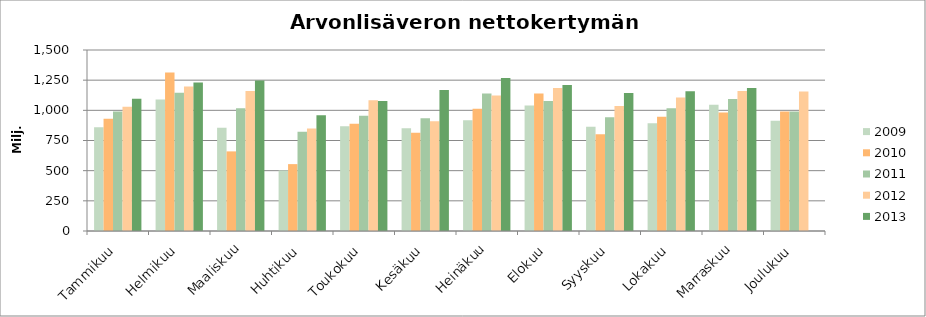
| Category | 2009 | 2010 | 2011 | 2012 | 2013 |
|---|---|---|---|---|---|
| Tammikuu | 858.934 | 929.369 | 989.979 | 1030.641 | 1096.075 |
| Helmikuu | 1089.664 | 1313.151 | 1145.438 | 1198.153 | 1230.33 |
| Maaliskuu | 856.122 | 659.776 | 1016.463 | 1160.067 | 1247.422 |
| Huhtikuu | 501.743 | 554.255 | 821.506 | 848.926 | 959.001 |
| Toukokuu | 867.163 | 889.769 | 955.963 | 1083.741 | 1078.37 |
| Kesäkuu | 851.056 | 814.024 | 933.418 | 909.246 | 1168.206 |
| Heinäkuu | 918.059 | 1013.537 | 1139.789 | 1122.196 | 1267.424 |
| Elokuu | 1040.537 | 1139.703 | 1077.137 | 1184.622 | 1210.636 |
| Syyskuu | 863.546 | 801.068 | 941.737 | 1035.954 | 1142.819 |
| Lokakuu | 892.063 | 947.674 | 1018.067 | 1107.374 | 1157.981 |
| Marraskuu | 1046.386 | 981.431 | 1094.661 | 1159.214 | 1185.544 |
| Joulukuu | 914.348 | 991.049 | 989.325 | 1156.453 | 0 |